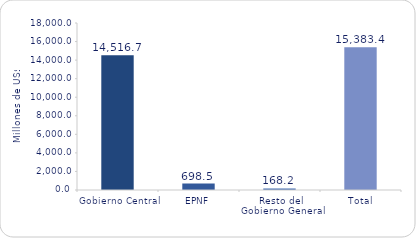
| Category | Series 1 |
|---|---|
| Gobierno Central | 14516.7 |
| EPNF | 698.5 |
| Resto del Gobierno General | 168.2 |
| Total | 15383.4 |